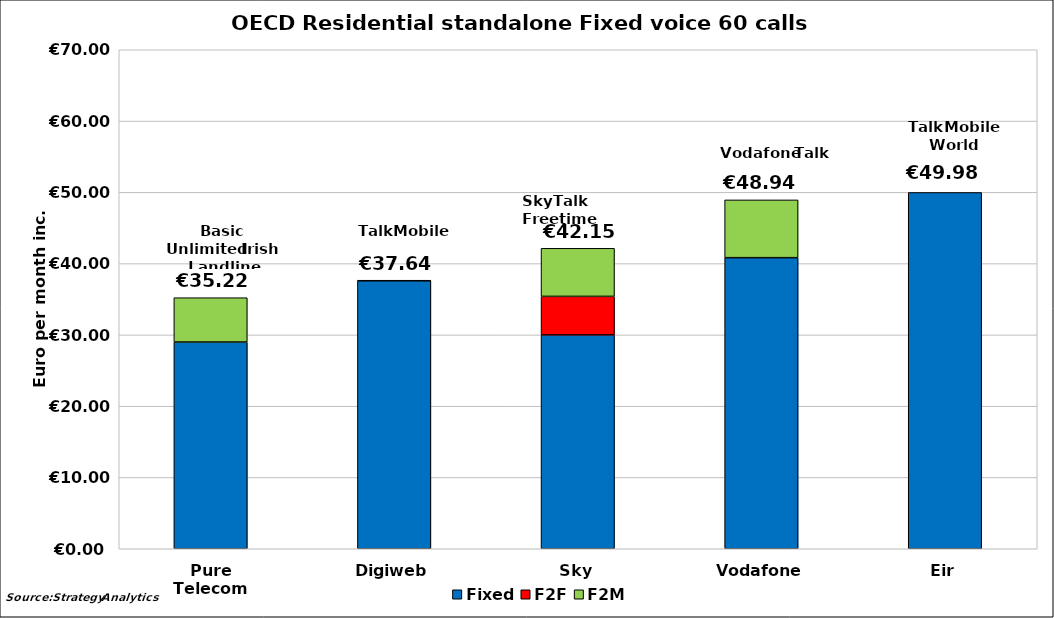
| Category | Fixed | F2F | F2M | Intn |
|---|---|---|---|---|
| Pure Telecom | 29 | 0 | 6.218 | 0 |
| Digiweb | 37.6 | 0 | 0.038 | 0 |
| Sky | 30 | 5.403 | 6.746 | 0 |
| Vodafone | 40.833 | 0 | 8.103 | 0 |
| Eir | 49.98 | 0 | 0 | 0 |